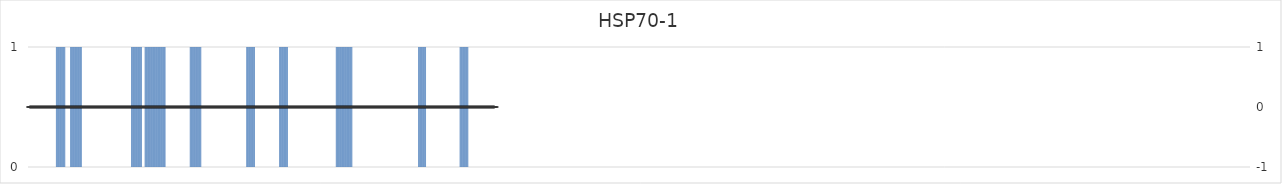
| Category | HSP70-1 |
|---|---|
| 1.0 | 0 |
| 2.0 | 0 |
| 3.0 | 0 |
| 4.0 | 0 |
| 5.0 | 0 |
| 6.0 | 0 |
| 7.0 | 0 |
| 8.0 | 0 |
| 9.0 | 0 |
| 10.0 | 0 |
| 11.0 | 0 |
| 12.0 | 0 |
| 13.0 | 0 |
| 14.0 | 0 |
| 15.0 | 0 |
| 16.0 | 0 |
| 17.0 | 0 |
| 18.0 | 0 |
| 19.0 | 0 |
| 20.0 | 0 |
| 21.0 | 0 |
| 22.0 | 0 |
| 23.0 | 0 |
| 24.0 | 0 |
| 25.0 | 0 |
| 26.0 | 0 |
| 27.0 | 0 |
| 28.0 | 0 |
| 29.0 | 0 |
| 30.0 | 0 |
| 31.0 | 0 |
| 32.0 | 0 |
| 33.0 | 0 |
| 34.0 | 0 |
| 35.0 | 0 |
| 36.0 | 0 |
| 37.0 | 0 |
| 38.0 | 0 |
| 39.0 | 0 |
| 40.0 | 1 |
| 41.0 | 1 |
| 42.0 | 1 |
| 43.0 | 1 |
| 44.0 | 1 |
| 45.0 | 1 |
| 46.0 | 1 |
| 47.0 | 1 |
| 48.0 | 1 |
| 49.0 | 1 |
| 50.0 | 1 |
| 51.0 | 1 |
| 52.0 | 1 |
| 53.0 | 0 |
| 54.0 | 0 |
| 55.0 | 0 |
| 56.0 | 0 |
| 57.0 | 0 |
| 58.0 | 0 |
| 59.0 | 0 |
| 60.0 | 1 |
| 61.0 | 1 |
| 62.0 | 1 |
| 63.0 | 1 |
| 64.0 | 1 |
| 65.0 | 1 |
| 66.0 | 1 |
| 67.0 | 1 |
| 68.0 | 1 |
| 69.0 | 1 |
| 70.0 | 1 |
| 71.0 | 1 |
| 72.0 | 1 |
| 73.0 | 1 |
| 74.0 | 1 |
| 75.0 | 1 |
| 76.0 | 0 |
| 77.0 | 0 |
| 78.0 | 0 |
| 79.0 | 0 |
| 80.0 | 0 |
| 81.0 | 0 |
| 82.0 | 0 |
| 83.0 | 0 |
| 84.0 | 0 |
| 85.0 | 0 |
| 86.0 | 0 |
| 87.0 | 0 |
| 88.0 | 0 |
| 89.0 | 0 |
| 90.0 | 0 |
| 91.0 | 0 |
| 92.0 | 0 |
| 93.0 | 0 |
| 94.0 | 0 |
| 95.0 | 0 |
| 96.0 | 0 |
| 97.0 | 0 |
| 98.0 | 0 |
| 99.0 | 0 |
| 100.0 | 0 |
| 101.0 | 0 |
| 102.0 | 0 |
| 103.0 | 0 |
| 104.0 | 0 |
| 105.0 | 0 |
| 106.0 | 0 |
| 107.0 | 0 |
| 108.0 | 0 |
| 109.0 | 0 |
| 110.0 | 0 |
| 111.0 | 0 |
| 112.0 | 0 |
| 113.0 | 0 |
| 114.0 | 0 |
| 115.0 | 0 |
| 116.0 | 0 |
| 117.0 | 0 |
| 118.0 | 0 |
| 119.0 | 0 |
| 120.0 | 0 |
| 121.0 | 0 |
| 122.0 | 0 |
| 123.0 | 0 |
| 124.0 | 0 |
| 125.0 | 0 |
| 126.0 | 0 |
| 127.0 | 0 |
| 128.0 | 0 |
| 129.0 | 0 |
| 130.0 | 0 |
| 131.0 | 0 |
| 132.0 | 0 |
| 133.0 | 0 |
| 134.0 | 0 |
| 135.0 | 0 |
| 136.0 | 0 |
| 137.0 | 0 |
| 138.0 | 0 |
| 139.0 | 0 |
| 140.0 | 0 |
| 141.0 | 0 |
| 142.0 | 0 |
| 143.0 | 0 |
| 144.0 | 0 |
| 145.0 | 1 |
| 146.0 | 1 |
| 147.0 | 1 |
| 148.0 | 1 |
| 149.0 | 1 |
| 150.0 | 1 |
| 151.0 | 1 |
| 152.0 | 1 |
| 153.0 | 1 |
| 154.0 | 1 |
| 155.0 | 1 |
| 156.0 | 1 |
| 157.0 | 1 |
| 158.0 | 1 |
| 159.0 | 1 |
| 160.0 | 0 |
| 161.0 | 0 |
| 162.0 | 0 |
| 163.0 | 0 |
| 164.0 | 1 |
| 165.0 | 1 |
| 166.0 | 1 |
| 167.0 | 1 |
| 168.0 | 1 |
| 169.0 | 1 |
| 170.0 | 1 |
| 171.0 | 1 |
| 172.0 | 1 |
| 173.0 | 1 |
| 174.0 | 1 |
| 175.0 | 1 |
| 176.0 | 1 |
| 177.0 | 1 |
| 178.0 | 1 |
| 179.0 | 1 |
| 180.0 | 1 |
| 181.0 | 1 |
| 182.0 | 1 |
| 183.0 | 1 |
| 184.0 | 1 |
| 185.0 | 1 |
| 186.0 | 1 |
| 187.0 | 1 |
| 188.0 | 1 |
| 189.0 | 1 |
| 190.0 | 1 |
| 191.0 | 1 |
| 192.0 | 1 |
| 193.0 | 0 |
| 194.0 | 0 |
| 195.0 | 0 |
| 196.0 | 0 |
| 197.0 | 0 |
| 198.0 | 0 |
| 199.0 | 0 |
| 200.0 | 0 |
| 201.0 | 0 |
| 202.0 | 0 |
| 203.0 | 0 |
| 204.0 | 0 |
| 205.0 | 0 |
| 206.0 | 0 |
| 207.0 | 0 |
| 208.0 | 0 |
| 209.0 | 0 |
| 210.0 | 0 |
| 211.0 | 0 |
| 212.0 | 0 |
| 213.0 | 0 |
| 214.0 | 0 |
| 215.0 | 0 |
| 216.0 | 0 |
| 217.0 | 0 |
| 218.0 | 0 |
| 219.0 | 0 |
| 220.0 | 0 |
| 221.0 | 0 |
| 222.0 | 0 |
| 223.0 | 0 |
| 224.0 | 0 |
| 225.0 | 0 |
| 226.0 | 0 |
| 227.0 | 1 |
| 228.0 | 1 |
| 229.0 | 1 |
| 230.0 | 1 |
| 231.0 | 1 |
| 232.0 | 1 |
| 233.0 | 1 |
| 234.0 | 1 |
| 235.0 | 1 |
| 236.0 | 1 |
| 237.0 | 1 |
| 238.0 | 1 |
| 239.0 | 1 |
| 240.0 | 1 |
| 241.0 | 1 |
| 242.0 | 1 |
| 243.0 | 0 |
| 244.0 | 0 |
| 245.0 | 0 |
| 246.0 | 0 |
| 247.0 | 0 |
| 248.0 | 0 |
| 249.0 | 0 |
| 250.0 | 0 |
| 251.0 | 0 |
| 252.0 | 0 |
| 253.0 | 0 |
| 254.0 | 0 |
| 255.0 | 0 |
| 256.0 | 0 |
| 257.0 | 0 |
| 258.0 | 0 |
| 259.0 | 0 |
| 260.0 | 0 |
| 261.0 | 0 |
| 262.0 | 0 |
| 263.0 | 0 |
| 264.0 | 0 |
| 265.0 | 0 |
| 266.0 | 0 |
| 267.0 | 0 |
| 268.0 | 0 |
| 269.0 | 0 |
| 270.0 | 0 |
| 271.0 | 0 |
| 272.0 | 0 |
| 273.0 | 0 |
| 274.0 | 0 |
| 275.0 | 0 |
| 276.0 | 0 |
| 277.0 | 0 |
| 278.0 | 0 |
| 279.0 | 0 |
| 280.0 | 0 |
| 281.0 | 0 |
| 282.0 | 0 |
| 283.0 | 0 |
| 284.0 | 0 |
| 285.0 | 0 |
| 286.0 | 0 |
| 287.0 | 0 |
| 288.0 | 0 |
| 289.0 | 0 |
| 290.0 | 0 |
| 291.0 | 0 |
| 292.0 | 0 |
| 293.0 | 0 |
| 294.0 | 0 |
| 295.0 | 0 |
| 296.0 | 0 |
| 297.0 | 0 |
| 298.0 | 0 |
| 299.0 | 0 |
| 300.0 | 0 |
| 301.0 | 0 |
| 302.0 | 0 |
| 303.0 | 0 |
| 304.0 | 0 |
| 305.0 | 0 |
| 306.0 | 1 |
| 307.0 | 1 |
| 308.0 | 1 |
| 309.0 | 1 |
| 310.0 | 1 |
| 311.0 | 1 |
| 312.0 | 1 |
| 313.0 | 1 |
| 314.0 | 1 |
| 315.0 | 1 |
| 316.0 | 1 |
| 317.0 | 1 |
| 318.0 | 0 |
| 319.0 | 0 |
| 320.0 | 0 |
| 321.0 | 0 |
| 322.0 | 0 |
| 323.0 | 0 |
| 324.0 | 0 |
| 325.0 | 0 |
| 326.0 | 0 |
| 327.0 | 0 |
| 328.0 | 0 |
| 329.0 | 0 |
| 330.0 | 0 |
| 331.0 | 0 |
| 332.0 | 0 |
| 333.0 | 0 |
| 334.0 | 0 |
| 335.0 | 0 |
| 336.0 | 0 |
| 337.0 | 0 |
| 338.0 | 0 |
| 339.0 | 0 |
| 340.0 | 0 |
| 341.0 | 0 |
| 342.0 | 0 |
| 343.0 | 0 |
| 344.0 | 0 |
| 345.0 | 0 |
| 346.0 | 0 |
| 347.0 | 0 |
| 348.0 | 0 |
| 349.0 | 0 |
| 350.0 | 0 |
| 351.0 | 0 |
| 352.0 | 1 |
| 353.0 | 1 |
| 354.0 | 1 |
| 355.0 | 1 |
| 356.0 | 1 |
| 357.0 | 1 |
| 358.0 | 1 |
| 359.0 | 1 |
| 360.0 | 1 |
| 361.0 | 1 |
| 362.0 | 1 |
| 363.0 | 1 |
| 364.0 | 0 |
| 365.0 | 0 |
| 366.0 | 0 |
| 367.0 | 0 |
| 368.0 | 0 |
| 369.0 | 0 |
| 370.0 | 0 |
| 371.0 | 0 |
| 372.0 | 0 |
| 373.0 | 0 |
| 374.0 | 0 |
| 375.0 | 0 |
| 376.0 | 0 |
| 377.0 | 0 |
| 378.0 | 0 |
| 379.0 | 0 |
| 380.0 | 0 |
| 381.0 | 0 |
| 382.0 | 0 |
| 383.0 | 0 |
| 384.0 | 0 |
| 385.0 | 0 |
| 386.0 | 0 |
| 387.0 | 0 |
| 388.0 | 0 |
| 389.0 | 0 |
| 390.0 | 0 |
| 391.0 | 0 |
| 392.0 | 0 |
| 393.0 | 0 |
| 394.0 | 0 |
| 395.0 | 0 |
| 396.0 | 0 |
| 397.0 | 0 |
| 398.0 | 0 |
| 399.0 | 0 |
| 400.0 | 0 |
| 401.0 | 0 |
| 402.0 | 0 |
| 403.0 | 0 |
| 404.0 | 0 |
| 405.0 | 0 |
| 406.0 | 0 |
| 407.0 | 0 |
| 408.0 | 0 |
| 409.0 | 0 |
| 410.0 | 0 |
| 411.0 | 0 |
| 412.0 | 0 |
| 413.0 | 0 |
| 414.0 | 0 |
| 415.0 | 0 |
| 416.0 | 0 |
| 417.0 | 0 |
| 418.0 | 0 |
| 419.0 | 0 |
| 420.0 | 0 |
| 421.0 | 0 |
| 422.0 | 0 |
| 423.0 | 0 |
| 424.0 | 0 |
| 425.0 | 0 |
| 426.0 | 0 |
| 427.0 | 0 |
| 428.0 | 0 |
| 429.0 | 0 |
| 430.0 | 0 |
| 431.0 | 1 |
| 432.0 | 1 |
| 433.0 | 1 |
| 434.0 | 1 |
| 435.0 | 1 |
| 436.0 | 1 |
| 437.0 | 1 |
| 438.0 | 1 |
| 439.0 | 1 |
| 440.0 | 1 |
| 441.0 | 1 |
| 442.0 | 1 |
| 443.0 | 1 |
| 444.0 | 1 |
| 445.0 | 1 |
| 446.0 | 1 |
| 447.0 | 1 |
| 448.0 | 1 |
| 449.0 | 1 |
| 450.0 | 1 |
| 451.0 | 1 |
| 452.0 | 1 |
| 453.0 | 1 |
| 454.0 | 0 |
| 455.0 | 0 |
| 456.0 | 0 |
| 457.0 | 0 |
| 458.0 | 0 |
| 459.0 | 0 |
| 460.0 | 0 |
| 461.0 | 0 |
| 462.0 | 0 |
| 463.0 | 0 |
| 464.0 | 0 |
| 465.0 | 0 |
| 466.0 | 0 |
| 467.0 | 0 |
| 468.0 | 0 |
| 469.0 | 0 |
| 470.0 | 0 |
| 471.0 | 0 |
| 472.0 | 0 |
| 473.0 | 0 |
| 474.0 | 0 |
| 475.0 | 0 |
| 476.0 | 0 |
| 477.0 | 0 |
| 478.0 | 0 |
| 479.0 | 0 |
| 480.0 | 0 |
| 481.0 | 0 |
| 482.0 | 0 |
| 483.0 | 0 |
| 484.0 | 0 |
| 485.0 | 0 |
| 486.0 | 0 |
| 487.0 | 0 |
| 488.0 | 0 |
| 489.0 | 0 |
| 490.0 | 0 |
| 491.0 | 0 |
| 492.0 | 0 |
| 493.0 | 0 |
| 494.0 | 0 |
| 495.0 | 0 |
| 496.0 | 0 |
| 497.0 | 0 |
| 498.0 | 0 |
| 499.0 | 0 |
| 500.0 | 0 |
| 501.0 | 0 |
| 502.0 | 0 |
| 503.0 | 0 |
| 504.0 | 0 |
| 505.0 | 0 |
| 506.0 | 0 |
| 507.0 | 0 |
| 508.0 | 0 |
| 509.0 | 0 |
| 510.0 | 0 |
| 511.0 | 0 |
| 512.0 | 0 |
| 513.0 | 0 |
| 514.0 | 0 |
| 515.0 | 0 |
| 516.0 | 0 |
| 517.0 | 0 |
| 518.0 | 0 |
| 519.0 | 0 |
| 520.0 | 0 |
| 521.0 | 0 |
| 522.0 | 0 |
| 523.0 | 0 |
| 524.0 | 0 |
| 525.0 | 0 |
| 526.0 | 0 |
| 527.0 | 0 |
| 528.0 | 0 |
| 529.0 | 0 |
| 530.0 | 0 |
| 531.0 | 0 |
| 532.0 | 0 |
| 533.0 | 0 |
| 534.0 | 0 |
| 535.0 | 0 |
| 536.0 | 0 |
| 537.0 | 0 |
| 538.0 | 0 |
| 539.0 | 0 |
| 540.0 | 0 |
| 541.0 | 0 |
| 542.0 | 0 |
| 543.0 | 0 |
| 544.0 | 0 |
| 545.0 | 0 |
| 546.0 | 1 |
| 547.0 | 1 |
| 548.0 | 1 |
| 549.0 | 1 |
| 550.0 | 1 |
| 551.0 | 1 |
| 552.0 | 1 |
| 553.0 | 1 |
| 554.0 | 1 |
| 555.0 | 1 |
| 556.0 | 1 |
| 557.0 | 0 |
| 558.0 | 0 |
| 559.0 | 0 |
| 560.0 | 0 |
| 561.0 | 0 |
| 562.0 | 0 |
| 563.0 | 0 |
| 564.0 | 0 |
| 565.0 | 0 |
| 566.0 | 0 |
| 567.0 | 0 |
| 568.0 | 0 |
| 569.0 | 0 |
| 570.0 | 0 |
| 571.0 | 0 |
| 572.0 | 0 |
| 573.0 | 0 |
| 574.0 | 0 |
| 575.0 | 0 |
| 576.0 | 0 |
| 577.0 | 0 |
| 578.0 | 0 |
| 579.0 | 0 |
| 580.0 | 0 |
| 581.0 | 0 |
| 582.0 | 0 |
| 583.0 | 0 |
| 584.0 | 0 |
| 585.0 | 0 |
| 586.0 | 0 |
| 587.0 | 0 |
| 588.0 | 0 |
| 589.0 | 0 |
| 590.0 | 0 |
| 591.0 | 0 |
| 592.0 | 0 |
| 593.0 | 0 |
| 594.0 | 0 |
| 595.0 | 0 |
| 596.0 | 0 |
| 597.0 | 0 |
| 598.0 | 0 |
| 599.0 | 0 |
| 600.0 | 0 |
| 601.0 | 0 |
| 602.0 | 0 |
| 603.0 | 0 |
| 604.0 | 1 |
| 605.0 | 1 |
| 606.0 | 1 |
| 607.0 | 1 |
| 608.0 | 1 |
| 609.0 | 1 |
| 610.0 | 1 |
| 611.0 | 1 |
| 612.0 | 1 |
| 613.0 | 1 |
| 614.0 | 1 |
| 615.0 | 1 |
| 616.0 | 0 |
| 617.0 | 0 |
| 618.0 | 0 |
| 619.0 | 0 |
| 620.0 | 0 |
| 621.0 | 0 |
| 622.0 | 0 |
| 623.0 | 0 |
| 624.0 | 0 |
| 625.0 | 0 |
| 626.0 | 0 |
| 627.0 | 0 |
| 628.0 | 0 |
| 629.0 | 0 |
| 630.0 | 0 |
| 631.0 | 0 |
| 632.0 | 0 |
| 633.0 | 0 |
| 634.0 | 0 |
| 635.0 | 0 |
| 636.0 | 0 |
| 637.0 | 0 |
| 638.0 | 0 |
| 639.0 | 0 |
| 640.0 | 0 |
| 641.0 | 0 |
| 642.0 | 0 |
| 643.0 | 0 |
| 644.0 | 0 |
| 645.0 | 0 |
| 646.0 | 0 |
| 647.0 | 0 |
| 648.0 | 0 |
| 649.0 | 0 |
| 650.0 | 0 |
| 651.0 | 0 |
| 652.0 | 0 |
| 653.0 | 0 |
| 654.0 | 0 |
| 655.0 | 0 |
| 656.0 | 0 |
| 657.0 | 0 |
| 658.0 | 0 |
| 659.0 | 0 |
| 660.0 | 0 |
| 661.0 | 0 |
| 662.0 | 0 |
| 663.0 | 0 |
| 664.0 | 0 |
| 665.0 | 0 |
| 666.0 | 0 |
| 667.0 | 0 |
| 668.0 | 0 |
| 669.0 | 0 |
| 670.0 | 0 |
| 671.0 | 0 |
| 672.0 | 0 |
| 673.0 | 0 |
| 674.0 | 0 |
| 675.0 | 0 |
| 676.0 | 0 |
| 677.0 | 0 |
| 678.0 | 0 |
| 679.0 | 0 |
| 680.0 | 0 |
| 681.0 | 0 |
| 682.0 | 0 |
| 683.0 | 0 |
| 684.0 | 0 |
| 685.0 | 0 |
| 686.0 | 0 |
| 687.0 | 0 |
| 688.0 | 0 |
| 689.0 | 0 |
| 690.0 | 0 |
| 691.0 | 0 |
| 692.0 | 0 |
| 693.0 | 0 |
| 694.0 | 0 |
| 695.0 | 0 |
| 696.0 | 0 |
| 697.0 | 0 |
| 698.0 | 0 |
| 699.0 | 0 |
| 700.0 | 0 |
| 701.0 | 0 |
| 702.0 | 0 |
| 703.0 | 0 |
| 704.0 | 0 |
| 705.0 | 0 |
| 706.0 | 0 |
| 707.0 | 0 |
| 708.0 | 0 |
| 709.0 | 0 |
| 710.0 | 0 |
| 711.0 | 0 |
| 712.0 | 0 |
| 713.0 | 0 |
| 714.0 | 0 |
| 715.0 | 0 |
| 716.0 | 0 |
| 717.0 | 0 |
| 718.0 | 0 |
| 719.0 | 0 |
| 720.0 | 0 |
| 721.0 | 0 |
| 722.0 | 0 |
| 723.0 | 0 |
| 724.0 | 0 |
| 725.0 | 0 |
| 726.0 | 0 |
| 727.0 | 0 |
| 728.0 | 0 |
| 729.0 | 0 |
| 730.0 | 0 |
| 731.0 | 0 |
| 732.0 | 0 |
| 733.0 | 0 |
| 734.0 | 0 |
| 735.0 | 0 |
| 736.0 | 0 |
| 737.0 | 0 |
| 738.0 | 0 |
| 739.0 | 0 |
| 740.0 | 0 |
| 741.0 | 0 |
| 742.0 | 0 |
| 743.0 | 0 |
| 744.0 | 0 |
| 745.0 | 0 |
| 746.0 | 0 |
| 747.0 | 0 |
| 748.0 | 0 |
| 749.0 | 0 |
| 750.0 | 0 |
| 751.0 | 0 |
| 752.0 | 0 |
| 753.0 | 0 |
| 754.0 | 0 |
| 755.0 | 0 |
| 756.0 | 0 |
| 757.0 | 0 |
| 758.0 | 0 |
| 759.0 | 0 |
| 760.0 | 0 |
| 761.0 | 0 |
| 762.0 | 0 |
| 763.0 | 0 |
| 764.0 | 0 |
| 765.0 | 0 |
| 766.0 | 0 |
| 767.0 | 0 |
| 768.0 | 0 |
| 769.0 | 0 |
| 770.0 | 0 |
| 771.0 | 0 |
| 772.0 | 0 |
| 773.0 | 0 |
| 774.0 | 0 |
| 775.0 | 0 |
| 776.0 | 0 |
| 777.0 | 0 |
| 778.0 | 0 |
| 779.0 | 0 |
| 780.0 | 0 |
| 781.0 | 0 |
| 782.0 | 0 |
| 783.0 | 0 |
| 784.0 | 0 |
| 785.0 | 0 |
| 786.0 | 0 |
| 787.0 | 0 |
| 788.0 | 0 |
| 789.0 | 0 |
| 790.0 | 0 |
| 791.0 | 0 |
| 792.0 | 0 |
| 793.0 | 0 |
| 794.0 | 0 |
| 795.0 | 0 |
| 796.0 | 0 |
| 797.0 | 0 |
| 798.0 | 0 |
| 799.0 | 0 |
| 800.0 | 0 |
| 801.0 | 0 |
| 802.0 | 0 |
| 803.0 | 0 |
| 804.0 | 0 |
| 805.0 | 0 |
| 806.0 | 0 |
| 807.0 | 0 |
| 808.0 | 0 |
| 809.0 | 0 |
| 810.0 | 0 |
| 811.0 | 0 |
| 812.0 | 0 |
| 813.0 | 0 |
| 814.0 | 0 |
| 815.0 | 0 |
| 816.0 | 0 |
| 817.0 | 0 |
| 818.0 | 0 |
| 819.0 | 0 |
| 820.0 | 0 |
| 821.0 | 0 |
| 822.0 | 0 |
| 823.0 | 0 |
| 824.0 | 0 |
| 825.0 | 0 |
| 826.0 | 0 |
| 827.0 | 0 |
| 828.0 | 0 |
| 829.0 | 0 |
| 830.0 | 0 |
| 831.0 | 0 |
| 832.0 | 0 |
| 833.0 | 0 |
| 834.0 | 0 |
| 835.0 | 0 |
| 836.0 | 0 |
| 837.0 | 0 |
| 838.0 | 0 |
| 839.0 | 0 |
| 840.0 | 0 |
| 841.0 | 0 |
| 842.0 | 0 |
| 843.0 | 0 |
| 844.0 | 0 |
| 845.0 | 0 |
| 846.0 | 0 |
| 847.0 | 0 |
| 848.0 | 0 |
| 849.0 | 0 |
| 850.0 | 0 |
| 851.0 | 0 |
| 852.0 | 0 |
| 853.0 | 0 |
| 854.0 | 0 |
| 855.0 | 0 |
| 856.0 | 0 |
| 857.0 | 0 |
| 858.0 | 0 |
| 859.0 | 0 |
| 860.0 | 0 |
| 861.0 | 0 |
| 862.0 | 0 |
| 863.0 | 0 |
| 864.0 | 0 |
| 865.0 | 0 |
| 866.0 | 0 |
| 867.0 | 0 |
| 868.0 | 0 |
| 869.0 | 0 |
| 870.0 | 0 |
| 871.0 | 0 |
| 872.0 | 0 |
| 873.0 | 0 |
| 874.0 | 0 |
| 875.0 | 0 |
| 876.0 | 0 |
| 877.0 | 0 |
| 878.0 | 0 |
| 879.0 | 0 |
| 880.0 | 0 |
| 881.0 | 0 |
| 882.0 | 0 |
| 883.0 | 0 |
| 884.0 | 0 |
| 885.0 | 0 |
| 886.0 | 0 |
| 887.0 | 0 |
| 888.0 | 0 |
| 889.0 | 0 |
| 890.0 | 0 |
| 891.0 | 0 |
| 892.0 | 0 |
| 893.0 | 0 |
| 894.0 | 0 |
| 895.0 | 0 |
| 896.0 | 0 |
| 897.0 | 0 |
| 898.0 | 0 |
| 899.0 | 0 |
| 900.0 | 0 |
| 901.0 | 0 |
| 902.0 | 0 |
| 903.0 | 0 |
| 904.0 | 0 |
| 905.0 | 0 |
| 906.0 | 0 |
| 907.0 | 0 |
| 908.0 | 0 |
| 909.0 | 0 |
| 910.0 | 0 |
| 911.0 | 0 |
| 912.0 | 0 |
| 913.0 | 0 |
| 914.0 | 0 |
| 915.0 | 0 |
| 916.0 | 0 |
| 917.0 | 0 |
| 918.0 | 0 |
| 919.0 | 0 |
| 920.0 | 0 |
| 921.0 | 0 |
| 922.0 | 0 |
| 923.0 | 0 |
| 924.0 | 0 |
| 925.0 | 0 |
| 926.0 | 0 |
| 927.0 | 0 |
| 928.0 | 0 |
| 929.0 | 0 |
| 930.0 | 0 |
| 931.0 | 0 |
| 932.0 | 0 |
| 933.0 | 0 |
| 934.0 | 0 |
| 935.0 | 0 |
| 936.0 | 0 |
| 937.0 | 0 |
| 938.0 | 0 |
| 939.0 | 0 |
| 940.0 | 0 |
| 941.0 | 0 |
| 942.0 | 0 |
| 943.0 | 0 |
| 944.0 | 0 |
| 945.0 | 0 |
| 946.0 | 0 |
| 947.0 | 0 |
| 948.0 | 0 |
| 949.0 | 0 |
| 950.0 | 0 |
| 951.0 | 0 |
| 952.0 | 0 |
| 953.0 | 0 |
| 954.0 | 0 |
| 955.0 | 0 |
| 956.0 | 0 |
| 957.0 | 0 |
| 958.0 | 0 |
| 959.0 | 0 |
| 960.0 | 0 |
| 961.0 | 0 |
| 962.0 | 0 |
| 963.0 | 0 |
| 964.0 | 0 |
| 965.0 | 0 |
| 966.0 | 0 |
| 967.0 | 0 |
| 968.0 | 0 |
| 969.0 | 0 |
| 970.0 | 0 |
| 971.0 | 0 |
| 972.0 | 0 |
| 973.0 | 0 |
| 974.0 | 0 |
| 975.0 | 0 |
| 976.0 | 0 |
| 977.0 | 0 |
| 978.0 | 0 |
| 979.0 | 0 |
| 980.0 | 0 |
| 981.0 | 0 |
| 982.0 | 0 |
| 983.0 | 0 |
| 984.0 | 0 |
| 985.0 | 0 |
| 986.0 | 0 |
| 987.0 | 0 |
| 988.0 | 0 |
| 989.0 | 0 |
| 990.0 | 0 |
| 991.0 | 0 |
| 992.0 | 0 |
| 993.0 | 0 |
| 994.0 | 0 |
| 995.0 | 0 |
| 996.0 | 0 |
| 997.0 | 0 |
| 998.0 | 0 |
| 999.0 | 0 |
| 1000.0 | 0 |
| 1001.0 | 0 |
| 1002.0 | 0 |
| 1003.0 | 0 |
| 1004.0 | 0 |
| 1005.0 | 0 |
| 1006.0 | 0 |
| 1007.0 | 0 |
| 1008.0 | 0 |
| 1009.0 | 0 |
| 1010.0 | 0 |
| 1011.0 | 0 |
| 1012.0 | 0 |
| 1013.0 | 0 |
| 1014.0 | 0 |
| 1015.0 | 0 |
| 1016.0 | 0 |
| 1017.0 | 0 |
| 1018.0 | 0 |
| 1019.0 | 0 |
| 1020.0 | 0 |
| 1021.0 | 0 |
| 1022.0 | 0 |
| 1023.0 | 0 |
| 1024.0 | 0 |
| 1025.0 | 0 |
| 1026.0 | 0 |
| 1027.0 | 0 |
| 1028.0 | 0 |
| 1029.0 | 0 |
| 1030.0 | 0 |
| 1031.0 | 0 |
| 1032.0 | 0 |
| 1033.0 | 0 |
| 1034.0 | 0 |
| 1035.0 | 0 |
| 1036.0 | 0 |
| 1037.0 | 0 |
| 1038.0 | 0 |
| 1039.0 | 0 |
| 1040.0 | 0 |
| 1041.0 | 0 |
| 1042.0 | 0 |
| 1043.0 | 0 |
| 1044.0 | 0 |
| 1045.0 | 0 |
| 1046.0 | 0 |
| 1047.0 | 0 |
| 1048.0 | 0 |
| 1049.0 | 0 |
| 1050.0 | 0 |
| 1051.0 | 0 |
| 1052.0 | 0 |
| 1053.0 | 0 |
| 1054.0 | 0 |
| 1055.0 | 0 |
| 1056.0 | 0 |
| 1057.0 | 0 |
| 1058.0 | 0 |
| 1059.0 | 0 |
| 1060.0 | 0 |
| 1061.0 | 0 |
| 1062.0 | 0 |
| 1063.0 | 0 |
| 1064.0 | 0 |
| 1065.0 | 0 |
| 1066.0 | 0 |
| 1067.0 | 0 |
| 1068.0 | 0 |
| 1069.0 | 0 |
| 1070.0 | 0 |
| 1071.0 | 0 |
| 1072.0 | 0 |
| 1073.0 | 0 |
| 1074.0 | 0 |
| 1075.0 | 0 |
| 1076.0 | 0 |
| 1077.0 | 0 |
| 1078.0 | 0 |
| 1079.0 | 0 |
| 1080.0 | 0 |
| 1081.0 | 0 |
| 1082.0 | 0 |
| 1083.0 | 0 |
| 1084.0 | 0 |
| 1085.0 | 0 |
| 1086.0 | 0 |
| 1087.0 | 0 |
| 1088.0 | 0 |
| 1089.0 | 0 |
| 1090.0 | 0 |
| 1091.0 | 0 |
| 1092.0 | 0 |
| 1093.0 | 0 |
| 1094.0 | 0 |
| 1095.0 | 0 |
| 1096.0 | 0 |
| 1097.0 | 0 |
| 1098.0 | 0 |
| 1099.0 | 0 |
| 1100.0 | 0 |
| 1101.0 | 0 |
| 1102.0 | 0 |
| 1103.0 | 0 |
| 1104.0 | 0 |
| 1105.0 | 0 |
| 1106.0 | 0 |
| 1107.0 | 0 |
| 1108.0 | 0 |
| 1109.0 | 0 |
| 1110.0 | 0 |
| 1111.0 | 0 |
| 1112.0 | 0 |
| 1113.0 | 0 |
| 1114.0 | 0 |
| 1115.0 | 0 |
| 1116.0 | 0 |
| 1117.0 | 0 |
| 1118.0 | 0 |
| 1119.0 | 0 |
| 1120.0 | 0 |
| 1121.0 | 0 |
| 1122.0 | 0 |
| 1123.0 | 0 |
| 1124.0 | 0 |
| 1125.0 | 0 |
| 1126.0 | 0 |
| 1127.0 | 0 |
| 1128.0 | 0 |
| 1129.0 | 0 |
| 1130.0 | 0 |
| 1131.0 | 0 |
| 1132.0 | 0 |
| 1133.0 | 0 |
| 1134.0 | 0 |
| 1135.0 | 0 |
| 1136.0 | 0 |
| 1137.0 | 0 |
| 1138.0 | 0 |
| 1139.0 | 0 |
| 1140.0 | 0 |
| 1141.0 | 0 |
| 1142.0 | 0 |
| 1143.0 | 0 |
| 1144.0 | 0 |
| 1145.0 | 0 |
| 1146.0 | 0 |
| 1147.0 | 0 |
| 1148.0 | 0 |
| 1149.0 | 0 |
| 1150.0 | 0 |
| 1151.0 | 0 |
| 1152.0 | 0 |
| 1153.0 | 0 |
| 1154.0 | 0 |
| 1155.0 | 0 |
| 1156.0 | 0 |
| 1157.0 | 0 |
| 1158.0 | 0 |
| 1159.0 | 0 |
| 1160.0 | 0 |
| 1161.0 | 0 |
| 1162.0 | 0 |
| 1163.0 | 0 |
| 1164.0 | 0 |
| 1165.0 | 0 |
| 1166.0 | 0 |
| 1167.0 | 0 |
| 1168.0 | 0 |
| 1169.0 | 0 |
| 1170.0 | 0 |
| 1171.0 | 0 |
| 1172.0 | 0 |
| 1173.0 | 0 |
| 1174.0 | 0 |
| 1175.0 | 0 |
| 1176.0 | 0 |
| 1177.0 | 0 |
| 1178.0 | 0 |
| 1179.0 | 0 |
| 1180.0 | 0 |
| 1181.0 | 0 |
| 1182.0 | 0 |
| 1183.0 | 0 |
| 1184.0 | 0 |
| 1185.0 | 0 |
| 1186.0 | 0 |
| 1187.0 | 0 |
| 1188.0 | 0 |
| 1189.0 | 0 |
| 1190.0 | 0 |
| 1191.0 | 0 |
| 1192.0 | 0 |
| 1193.0 | 0 |
| 1194.0 | 0 |
| 1195.0 | 0 |
| 1196.0 | 0 |
| 1197.0 | 0 |
| 1198.0 | 0 |
| 1199.0 | 0 |
| 1200.0 | 0 |
| 1201.0 | 0 |
| 1202.0 | 0 |
| 1203.0 | 0 |
| 1204.0 | 0 |
| 1205.0 | 0 |
| 1206.0 | 0 |
| 1207.0 | 0 |
| 1208.0 | 0 |
| 1209.0 | 0 |
| 1210.0 | 0 |
| 1211.0 | 0 |
| 1212.0 | 0 |
| 1213.0 | 0 |
| 1214.0 | 0 |
| 1215.0 | 0 |
| 1216.0 | 0 |
| 1217.0 | 0 |
| 1218.0 | 0 |
| 1219.0 | 0 |
| 1220.0 | 0 |
| 1221.0 | 0 |
| 1222.0 | 0 |
| 1223.0 | 0 |
| 1224.0 | 0 |
| 1225.0 | 0 |
| 1226.0 | 0 |
| 1227.0 | 0 |
| 1228.0 | 0 |
| 1229.0 | 0 |
| 1230.0 | 0 |
| 1231.0 | 0 |
| 1232.0 | 0 |
| 1233.0 | 0 |
| 1234.0 | 0 |
| 1235.0 | 0 |
| 1236.0 | 0 |
| 1237.0 | 0 |
| 1238.0 | 0 |
| 1239.0 | 0 |
| 1240.0 | 0 |
| 1241.0 | 0 |
| 1242.0 | 0 |
| 1243.0 | 0 |
| 1244.0 | 0 |
| 1245.0 | 0 |
| 1246.0 | 0 |
| 1247.0 | 0 |
| 1248.0 | 0 |
| 1249.0 | 0 |
| 1250.0 | 0 |
| 1251.0 | 0 |
| 1252.0 | 0 |
| 1253.0 | 0 |
| 1254.0 | 0 |
| 1255.0 | 0 |
| 1256.0 | 0 |
| 1257.0 | 0 |
| 1258.0 | 0 |
| 1259.0 | 0 |
| 1260.0 | 0 |
| 1261.0 | 0 |
| 1262.0 | 0 |
| 1263.0 | 0 |
| 1264.0 | 0 |
| 1265.0 | 0 |
| 1266.0 | 0 |
| 1267.0 | 0 |
| 1268.0 | 0 |
| 1269.0 | 0 |
| 1270.0 | 0 |
| 1271.0 | 0 |
| 1272.0 | 0 |
| 1273.0 | 0 |
| 1274.0 | 0 |
| 1275.0 | 0 |
| 1276.0 | 0 |
| 1277.0 | 0 |
| 1278.0 | 0 |
| 1279.0 | 0 |
| 1280.0 | 0 |
| 1281.0 | 0 |
| 1282.0 | 0 |
| 1283.0 | 0 |
| 1284.0 | 0 |
| 1285.0 | 0 |
| 1286.0 | 0 |
| 1287.0 | 0 |
| 1288.0 | 0 |
| 1289.0 | 0 |
| 1290.0 | 0 |
| 1291.0 | 0 |
| 1292.0 | 0 |
| 1293.0 | 0 |
| 1294.0 | 0 |
| 1295.0 | 0 |
| 1296.0 | 0 |
| 1297.0 | 0 |
| 1298.0 | 0 |
| 1299.0 | 0 |
| 1300.0 | 0 |
| 1301.0 | 0 |
| 1302.0 | 0 |
| 1303.0 | 0 |
| 1304.0 | 0 |
| 1305.0 | 0 |
| 1306.0 | 0 |
| 1307.0 | 0 |
| 1308.0 | 0 |
| 1309.0 | 0 |
| 1310.0 | 0 |
| 1311.0 | 0 |
| 1312.0 | 0 |
| 1313.0 | 0 |
| 1314.0 | 0 |
| 1315.0 | 0 |
| 1316.0 | 0 |
| 1317.0 | 0 |
| 1318.0 | 0 |
| 1319.0 | 0 |
| 1320.0 | 0 |
| 1321.0 | 0 |
| 1322.0 | 0 |
| 1323.0 | 0 |
| 1324.0 | 0 |
| 1325.0 | 0 |
| 1326.0 | 0 |
| 1327.0 | 0 |
| 1328.0 | 0 |
| 1329.0 | 0 |
| 1330.0 | 0 |
| 1331.0 | 0 |
| 1332.0 | 0 |
| 1333.0 | 0 |
| 1334.0 | 0 |
| 1335.0 | 0 |
| 1336.0 | 0 |
| 1337.0 | 0 |
| 1338.0 | 0 |
| 1339.0 | 0 |
| 1340.0 | 0 |
| 1341.0 | 0 |
| 1342.0 | 0 |
| 1343.0 | 0 |
| 1344.0 | 0 |
| 1345.0 | 0 |
| 1346.0 | 0 |
| 1347.0 | 0 |
| 1348.0 | 0 |
| 1349.0 | 0 |
| 1350.0 | 0 |
| 1351.0 | 0 |
| 1352.0 | 0 |
| 1353.0 | 0 |
| 1354.0 | 0 |
| 1355.0 | 0 |
| 1356.0 | 0 |
| 1357.0 | 0 |
| 1358.0 | 0 |
| 1359.0 | 0 |
| 1360.0 | 0 |
| 1361.0 | 0 |
| 1362.0 | 0 |
| 1363.0 | 0 |
| 1364.0 | 0 |
| 1365.0 | 0 |
| 1366.0 | 0 |
| 1367.0 | 0 |
| 1368.0 | 0 |
| 1369.0 | 0 |
| 1370.0 | 0 |
| 1371.0 | 0 |
| 1372.0 | 0 |
| 1373.0 | 0 |
| 1374.0 | 0 |
| 1375.0 | 0 |
| 1376.0 | 0 |
| 1377.0 | 0 |
| 1378.0 | 0 |
| 1379.0 | 0 |
| 1380.0 | 0 |
| 1381.0 | 0 |
| 1382.0 | 0 |
| 1383.0 | 0 |
| 1384.0 | 0 |
| 1385.0 | 0 |
| 1386.0 | 0 |
| 1387.0 | 0 |
| 1388.0 | 0 |
| 1389.0 | 0 |
| 1390.0 | 0 |
| 1391.0 | 0 |
| 1392.0 | 0 |
| 1393.0 | 0 |
| 1394.0 | 0 |
| 1395.0 | 0 |
| 1396.0 | 0 |
| 1397.0 | 0 |
| 1398.0 | 0 |
| 1399.0 | 0 |
| 1400.0 | 0 |
| 1401.0 | 0 |
| 1402.0 | 0 |
| 1403.0 | 0 |
| 1404.0 | 0 |
| 1405.0 | 0 |
| 1406.0 | 0 |
| 1407.0 | 0 |
| 1408.0 | 0 |
| 1409.0 | 0 |
| 1410.0 | 0 |
| 1411.0 | 0 |
| 1412.0 | 0 |
| 1413.0 | 0 |
| 1414.0 | 0 |
| 1415.0 | 0 |
| 1416.0 | 0 |
| 1417.0 | 0 |
| 1418.0 | 0 |
| 1419.0 | 0 |
| 1420.0 | 0 |
| 1421.0 | 0 |
| 1422.0 | 0 |
| 1423.0 | 0 |
| 1424.0 | 0 |
| 1425.0 | 0 |
| 1426.0 | 0 |
| 1427.0 | 0 |
| 1428.0 | 0 |
| 1429.0 | 0 |
| 1430.0 | 0 |
| 1431.0 | 0 |
| 1432.0 | 0 |
| 1433.0 | 0 |
| 1434.0 | 0 |
| 1435.0 | 0 |
| 1436.0 | 0 |
| 1437.0 | 0 |
| 1438.0 | 0 |
| 1439.0 | 0 |
| 1440.0 | 0 |
| 1441.0 | 0 |
| 1442.0 | 0 |
| 1443.0 | 0 |
| 1444.0 | 0 |
| 1445.0 | 0 |
| 1446.0 | 0 |
| 1447.0 | 0 |
| 1448.0 | 0 |
| 1449.0 | 0 |
| 1450.0 | 0 |
| 1451.0 | 0 |
| 1452.0 | 0 |
| 1453.0 | 0 |
| 1454.0 | 0 |
| 1455.0 | 0 |
| 1456.0 | 0 |
| 1457.0 | 0 |
| 1458.0 | 0 |
| 1459.0 | 0 |
| 1460.0 | 0 |
| 1461.0 | 0 |
| 1462.0 | 0 |
| 1463.0 | 0 |
| 1464.0 | 0 |
| 1465.0 | 0 |
| 1466.0 | 0 |
| 1467.0 | 0 |
| 1468.0 | 0 |
| 1469.0 | 0 |
| 1470.0 | 0 |
| 1471.0 | 0 |
| 1472.0 | 0 |
| 1473.0 | 0 |
| 1474.0 | 0 |
| 1475.0 | 0 |
| 1476.0 | 0 |
| 1477.0 | 0 |
| 1478.0 | 0 |
| 1479.0 | 0 |
| 1480.0 | 0 |
| 1481.0 | 0 |
| 1482.0 | 0 |
| 1483.0 | 0 |
| 1484.0 | 0 |
| 1485.0 | 0 |
| 1486.0 | 0 |
| 1487.0 | 0 |
| 1488.0 | 0 |
| 1489.0 | 0 |
| 1490.0 | 0 |
| 1491.0 | 0 |
| 1492.0 | 0 |
| 1493.0 | 0 |
| 1494.0 | 0 |
| 1495.0 | 0 |
| 1496.0 | 0 |
| 1497.0 | 0 |
| 1498.0 | 0 |
| 1499.0 | 0 |
| 1500.0 | 0 |
| 1501.0 | 0 |
| 1502.0 | 0 |
| 1503.0 | 0 |
| 1504.0 | 0 |
| 1505.0 | 0 |
| 1506.0 | 0 |
| 1507.0 | 0 |
| 1508.0 | 0 |
| 1509.0 | 0 |
| 1510.0 | 0 |
| 1511.0 | 0 |
| 1512.0 | 0 |
| 1513.0 | 0 |
| 1514.0 | 0 |
| 1515.0 | 0 |
| 1516.0 | 0 |
| 1517.0 | 0 |
| 1518.0 | 0 |
| 1519.0 | 0 |
| 1520.0 | 0 |
| 1521.0 | 0 |
| 1522.0 | 0 |
| 1523.0 | 0 |
| 1524.0 | 0 |
| 1525.0 | 0 |
| 1526.0 | 0 |
| 1527.0 | 0 |
| 1528.0 | 0 |
| 1529.0 | 0 |
| 1530.0 | 0 |
| 1531.0 | 0 |
| 1532.0 | 0 |
| 1533.0 | 0 |
| 1534.0 | 0 |
| 1535.0 | 0 |
| 1536.0 | 0 |
| 1537.0 | 0 |
| 1538.0 | 0 |
| 1539.0 | 0 |
| 1540.0 | 0 |
| 1541.0 | 0 |
| 1542.0 | 0 |
| 1543.0 | 0 |
| 1544.0 | 0 |
| 1545.0 | 0 |
| 1546.0 | 0 |
| 1547.0 | 0 |
| 1548.0 | 0 |
| 1549.0 | 0 |
| 1550.0 | 0 |
| 1551.0 | 0 |
| 1552.0 | 0 |
| 1553.0 | 0 |
| 1554.0 | 0 |
| 1555.0 | 0 |
| 1556.0 | 0 |
| 1557.0 | 0 |
| 1558.0 | 0 |
| 1559.0 | 0 |
| 1560.0 | 0 |
| 1561.0 | 0 |
| 1562.0 | 0 |
| 1563.0 | 0 |
| 1564.0 | 0 |
| 1565.0 | 0 |
| 1566.0 | 0 |
| 1567.0 | 0 |
| 1568.0 | 0 |
| 1569.0 | 0 |
| 1570.0 | 0 |
| 1571.0 | 0 |
| 1572.0 | 0 |
| 1573.0 | 0 |
| 1574.0 | 0 |
| 1575.0 | 0 |
| 1576.0 | 0 |
| 1577.0 | 0 |
| 1578.0 | 0 |
| 1579.0 | 0 |
| 1580.0 | 0 |
| 1581.0 | 0 |
| 1582.0 | 0 |
| 1583.0 | 0 |
| 1584.0 | 0 |
| 1585.0 | 0 |
| 1586.0 | 0 |
| 1587.0 | 0 |
| 1588.0 | 0 |
| 1589.0 | 0 |
| 1590.0 | 0 |
| 1591.0 | 0 |
| 1592.0 | 0 |
| 1593.0 | 0 |
| 1594.0 | 0 |
| 1595.0 | 0 |
| 1596.0 | 0 |
| 1597.0 | 0 |
| 1598.0 | 0 |
| 1599.0 | 0 |
| 1600.0 | 0 |
| 1601.0 | 0 |
| 1602.0 | 0 |
| 1603.0 | 0 |
| 1604.0 | 0 |
| 1605.0 | 0 |
| 1606.0 | 0 |
| 1607.0 | 0 |
| 1608.0 | 0 |
| 1609.0 | 0 |
| 1610.0 | 0 |
| 1611.0 | 0 |
| 1612.0 | 0 |
| 1613.0 | 0 |
| 1614.0 | 0 |
| 1615.0 | 0 |
| 1616.0 | 0 |
| 1617.0 | 0 |
| 1618.0 | 0 |
| 1619.0 | 0 |
| 1620.0 | 0 |
| 1621.0 | 0 |
| 1622.0 | 0 |
| 1623.0 | 0 |
| 1624.0 | 0 |
| 1625.0 | 0 |
| 1626.0 | 0 |
| 1627.0 | 0 |
| 1628.0 | 0 |
| 1629.0 | 0 |
| 1630.0 | 0 |
| 1631.0 | 0 |
| 1632.0 | 0 |
| 1633.0 | 0 |
| 1634.0 | 0 |
| 1635.0 | 0 |
| 1636.0 | 0 |
| 1637.0 | 0 |
| 1638.0 | 0 |
| 1639.0 | 0 |
| 1640.0 | 0 |
| 1641.0 | 0 |
| 1642.0 | 0 |
| 1643.0 | 0 |
| 1644.0 | 0 |
| 1645.0 | 0 |
| 1646.0 | 0 |
| 1647.0 | 0 |
| 1648.0 | 0 |
| 1649.0 | 0 |
| 1650.0 | 0 |
| 1651.0 | 0 |
| 1652.0 | 0 |
| 1653.0 | 0 |
| 1654.0 | 0 |
| 1655.0 | 0 |
| 1656.0 | 0 |
| 1657.0 | 0 |
| 1658.0 | 0 |
| 1659.0 | 0 |
| 1660.0 | 0 |
| 1661.0 | 0 |
| 1662.0 | 0 |
| 1663.0 | 0 |
| 1664.0 | 0 |
| 1665.0 | 0 |
| 1666.0 | 0 |
| 1667.0 | 0 |
| 1668.0 | 0 |
| 1669.0 | 0 |
| 1670.0 | 0 |
| 1671.0 | 0 |
| 1672.0 | 0 |
| 1673.0 | 0 |
| 1674.0 | 0 |
| 1675.0 | 0 |
| 1676.0 | 0 |
| 1677.0 | 0 |
| 1678.0 | 0 |
| 1679.0 | 0 |
| 1680.0 | 0 |
| 1681.0 | 0 |
| 1682.0 | 0 |
| 1683.0 | 0 |
| 1684.0 | 0 |
| 1685.0 | 0 |
| 1686.0 | 0 |
| 1687.0 | 0 |
| 1688.0 | 0 |
| 1689.0 | 0 |
| 1690.0 | 0 |
| 1691.0 | 0 |
| 1692.0 | 0 |
| 1693.0 | 0 |
| 1694.0 | 0 |
| 1695.0 | 0 |
| 1696.0 | 0 |
| 1697.0 | 0 |
| 1698.0 | 0 |
| 1699.0 | 0 |
| 1700.0 | 0 |
| 1701.0 | 0 |
| 1702.0 | 0 |
| 1703.0 | 0 |
| 1704.0 | 0 |
| 1705.0 | 0 |
| 1706.0 | 0 |
| 1707.0 | 0 |